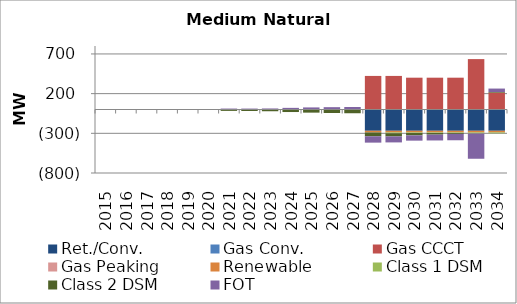
| Category | Ret./Conv. | Gas Conv. | Gas CCCT | Gas Peaking | Renewable | Class 1 DSM | Class 2 DSM | FOT |
|---|---|---|---|---|---|---|---|---|
| 2015.0 | 0 | 0 | 0 | 0 | 0 | 0 | -0.51 | 0.363 |
| 2016.0 | 0 | 0 | 0 | 0 | 0 | 0 | -1 | 0.681 |
| 2017.0 | 0 | 0 | 0 | 0 | 0 | 0 | -1.25 | 0.831 |
| 2018.0 | 0 | 0 | 0 | 0 | 0 | 0 | -1.78 | 1.057 |
| 2019.0 | 0 | 0 | 0 | 0 | 0 | 0 | -3.94 | 0.414 |
| 2020.0 | 0 | 0 | 0 | 0 | 0 | 0 | -6.13 | 1.505 |
| 2021.0 | 0 | 0 | 0 | 0 | 0 | -7.45 | -11.13 | 11.87 |
| 2022.0 | 0 | 0 | 0 | 0 | 0 | -3.72 | -15.01 | 11.705 |
| 2023.0 | 0 | 0 | 0 | 0 | 0 | 3.43 | -22 | 9.679 |
| 2024.0 | 0 | 0 | 0 | 0 | 0 | -0.3 | -31.61 | 20.617 |
| 2025.0 | 0 | 0 | 0 | 0 | 0 | -0.3 | -39.24 | 26.242 |
| 2026.0 | 0 | 0 | 0 | 0 | 0 | -0.32 | -43.58 | 29.468 |
| 2027.0 | 0 | 0 | 0 | 0 | 0 | -0.32 | -46.79 | 31.218 |
| 2028.0 | -268 | 0 | 423 | 0 | -21 | -0.32 | -48.2 | -79.912 |
| 2029.0 | -268 | 0 | 423 | 0 | -21 | -10.87 | -38.97 | -75.706 |
| 2030.0 | -268 | 0 | 400.783 | 0 | -21 | -7.47 | -29.17 | -66.749 |
| 2031.0 | -268 | 0 | 400.783 | 0 | -21 | -7.45 | -20.04 | -73.556 |
| 2032.0 | -268 | 0 | 400.783 | 0 | -21 | -7.45 | -10.55 | -80.546 |
| 2033.0 | -268 | 0 | 635 | 0 | -21 | -12.39 | -1.8 | -317.328 |
| 2034.0 | -268 | 0 | 212 | 0 | -21 | -11.3 | 8.08 | 43.686 |